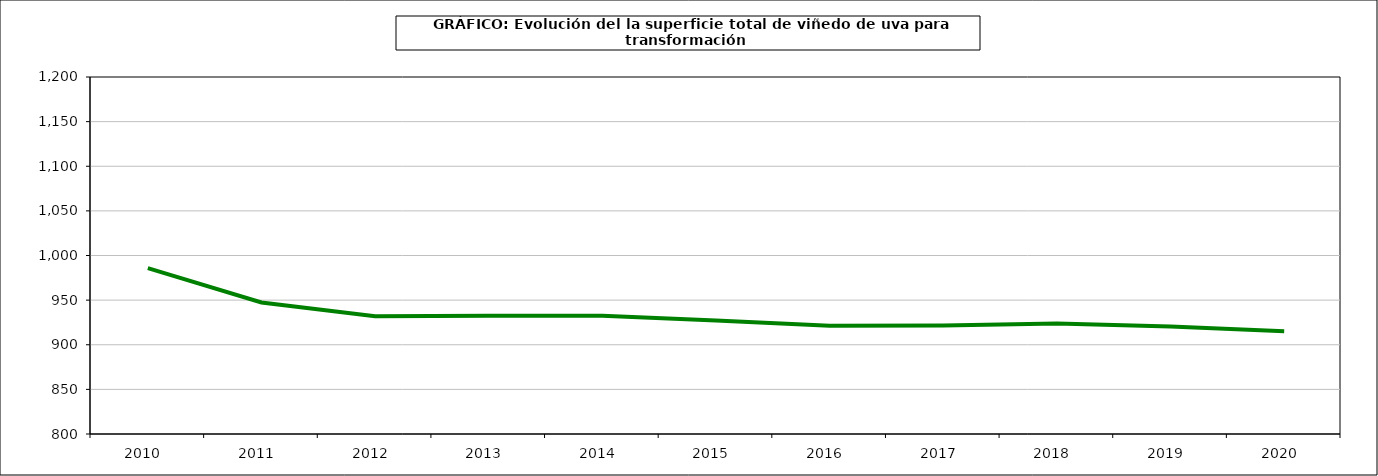
| Category | superficie |
|---|---|
| 2010.0 | 985.844 |
| 2011.0 | 947.36 |
| 2012.0 | 931.893 |
| 2013.0 | 932.509 |
| 2014.0 | 932.611 |
| 2015.0 | 927.067 |
| 2016.0 | 921.18 |
| 2017.0 | 921.642 |
| 2018.0 | 923.712 |
| 2019.0 | 920.525 |
| 2020.0 | 915.01 |